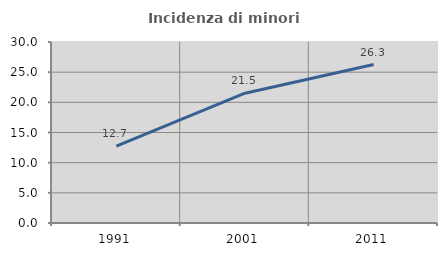
| Category | Incidenza di minori stranieri |
|---|---|
| 1991.0 | 12.727 |
| 2001.0 | 21.51 |
| 2011.0 | 26.27 |